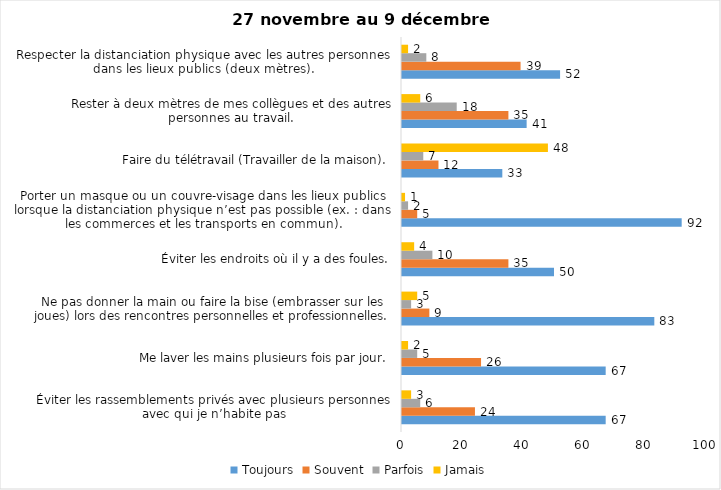
| Category | Toujours | Souvent | Parfois | Jamais |
|---|---|---|---|---|
| Éviter les rassemblements privés avec plusieurs personnes avec qui je n’habite pas | 67 | 24 | 6 | 3 |
| Me laver les mains plusieurs fois par jour. | 67 | 26 | 5 | 2 |
| Ne pas donner la main ou faire la bise (embrasser sur les joues) lors des rencontres personnelles et professionnelles. | 83 | 9 | 3 | 5 |
| Éviter les endroits où il y a des foules. | 50 | 35 | 10 | 4 |
| Porter un masque ou un couvre-visage dans les lieux publics lorsque la distanciation physique n’est pas possible (ex. : dans les commerces et les transports en commun). | 92 | 5 | 2 | 1 |
| Faire du télétravail (Travailler de la maison). | 33 | 12 | 7 | 48 |
| Rester à deux mètres de mes collègues et des autres personnes au travail. | 41 | 35 | 18 | 6 |
| Respecter la distanciation physique avec les autres personnes dans les lieux publics (deux mètres). | 52 | 39 | 8 | 2 |